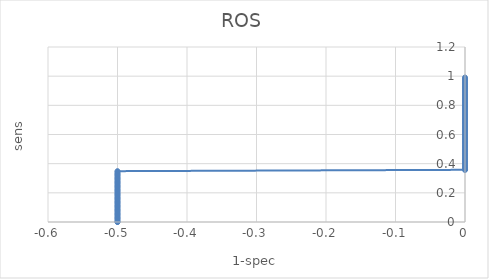
| Category | sens |
|---|---|
| -0.5 | 0 |
| -0.5 | 0 |
| -0.5 | 0.009 |
| -0.5 | 0.018 |
| -0.5 | 0.028 |
| -0.5 | 0.037 |
| -0.5 | 0.046 |
| -0.5 | 0.055 |
| -0.5 | 0.064 |
| -0.5 | 0.073 |
| -0.5 | 0.083 |
| -0.5 | 0.092 |
| -0.5 | 0.101 |
| -0.5 | 0.11 |
| -0.5 | 0.119 |
| -0.5 | 0.128 |
| -0.5 | 0.138 |
| -0.5 | 0.147 |
| -0.5 | 0.156 |
| -0.5 | 0.165 |
| -0.5 | 0.174 |
| -0.5 | 0.183 |
| -0.5 | 0.193 |
| -0.5 | 0.202 |
| -0.5 | 0.211 |
| -0.5 | 0.22 |
| -0.5 | 0.229 |
| -0.5 | 0.239 |
| -0.5 | 0.248 |
| -0.5 | 0.257 |
| -0.5 | 0.266 |
| -0.5 | 0.275 |
| -0.5 | 0.284 |
| -0.5 | 0.294 |
| -0.5 | 0.303 |
| -0.5 | 0.312 |
| -0.5 | 0.321 |
| -0.5 | 0.33 |
| -0.5 | 0.339 |
| -0.5 | 0.349 |
| 0.0 | 0.358 |
| 0.0 | 0.358 |
| 0.0 | 0.367 |
| 0.0 | 0.376 |
| 0.0 | 0.385 |
| 0.0 | 0.394 |
| 0.0 | 0.404 |
| 0.0 | 0.413 |
| 0.0 | 0.422 |
| 0.0 | 0.431 |
| 0.0 | 0.44 |
| 0.0 | 0.45 |
| 0.0 | 0.459 |
| 0.0 | 0.468 |
| 0.0 | 0.477 |
| 0.0 | 0.486 |
| 0.0 | 0.495 |
| 0.0 | 0.505 |
| 0.0 | 0.514 |
| 0.0 | 0.523 |
| 0.0 | 0.532 |
| 0.0 | 0.541 |
| 0.0 | 0.55 |
| 0.0 | 0.56 |
| 0.0 | 0.569 |
| 0.0 | 0.578 |
| 0.0 | 0.587 |
| 0.0 | 0.596 |
| 0.0 | 0.606 |
| 0.0 | 0.615 |
| 0.0 | 0.624 |
| 0.0 | 0.633 |
| 0.0 | 0.642 |
| 0.0 | 0.651 |
| 0.0 | 0.661 |
| 0.0 | 0.67 |
| 0.0 | 0.679 |
| 0.0 | 0.688 |
| 0.0 | 0.697 |
| 0.0 | 0.706 |
| 0.0 | 0.716 |
| 0.0 | 0.725 |
| 0.0 | 0.734 |
| 0.0 | 0.743 |
| 0.0 | 0.752 |
| 0.0 | 0.761 |
| 0.0 | 0.771 |
| 0.0 | 0.78 |
| 0.0 | 0.789 |
| 0.0 | 0.798 |
| 0.0 | 0.807 |
| 0.0 | 0.817 |
| 0.0 | 0.826 |
| 0.0 | 0.835 |
| 0.0 | 0.844 |
| 0.0 | 0.853 |
| 0.0 | 0.862 |
| 0.0 | 0.872 |
| 0.0 | 0.881 |
| 0.0 | 0.89 |
| 0.0 | 0.899 |
| 0.0 | 0.908 |
| 0.0 | 0.917 |
| 0.0 | 0.927 |
| 0.0 | 0.936 |
| 0.0 | 0.945 |
| 0.0 | 0.954 |
| 0.0 | 0.963 |
| 0.0 | 0.972 |
| 0.0 | 0.982 |
| 0.0 | 0.991 |